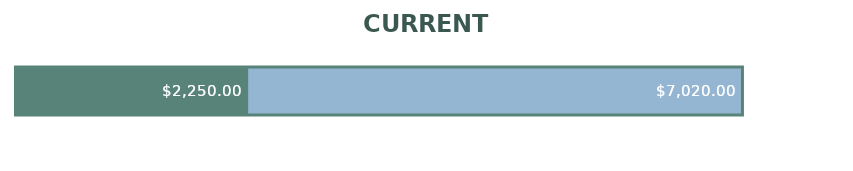
| Category | Total Income | Total Expenses |
|---|---|---|
| 0 | 7020 | 2250 |